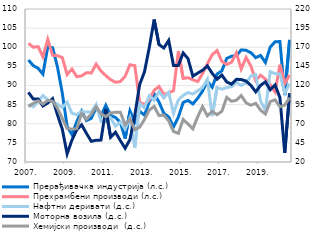
| Category | Прерађивачка индустрија (л.с.) | Прехрамбени производи (л.с.) |
|---|---|---|
| 2007. | 96.651 | 101.028 |
| II | 95.21 | 100.002 |
| III | 94.499 | 100.166 |
| IV | 92.976 | 97.51 |
| 2008. | 100.116 | 102.085 |
| II | 99.884 | 97.915 |
| III | 94.879 | 97.809 |
| IV | 88.057 | 97.293 |
| 2009. | 79.311 | 92.848 |
| II | 77.148 | 94.307 |
| III | 80.58 | 92.296 |
| IV | 83.296 | 92.52 |
| 2010. | 80.822 | 93.363 |
| II | 81.431 | 93.266 |
| III | 84.198 | 95.591 |
| IV | 82.013 | 93.805 |
| 2011. | 84.817 | 92.572 |
| II | 82.209 | 91.545 |
| III | 81.633 | 90.844 |
| IV | 80.389 | 91.028 |
| 2012. | 76.134 | 92.405 |
| II | 83.348 | 95.422 |
| III | 80.439 | 95.199 |
| IV | 83.276 | 85.639 |
| 2013. | 82.255 | 85.006 |
| II | 85.815 | 86.298 |
| III | 87.826 | 88.768 |
| IV | 85.67 | 89.756 |
| 2014. | 82.759 | 87.633 |
| II | 81.779 | 88.108 |
| III | 79.196 | 88.628 |
| IV | 81.726 | 98.937 |
| 2015. | 85.571 | 91.842 |
| II | 86.101 | 92.036 |
| III | 85.188 | 91.492 |
| IV | 86.664 | 91.028 |
| 2016. | 88.527 | 93.074 |
| II | 91.119 | 95.676 |
| III | 89.544 | 98.05 |
| IV | 92.993 | 99.141 |
| 2017. | 93.84 | 96.292 |
| II | 97.075 | 95.511 |
| III | 97.66 | 96.078 |
| IV | 97.761 | 98.529 |
| 2018. | 99.301 | 94.312 |
| II | 99.211 | 97.327 |
| III | 98.565 | 95.111 |
| IV | 97.291 | 91.28 |
| 2019. | 97.862 | 92.716 |
| II | 96.034 | 91.667 |
| III | 100.027 | 90.215 |
| IV | 101.438 | 88.297 |
| 2020. | 101.495 | 95.428 |
| II | 87.515 | 90.467 |
| III | 101.946 | 92.751 |